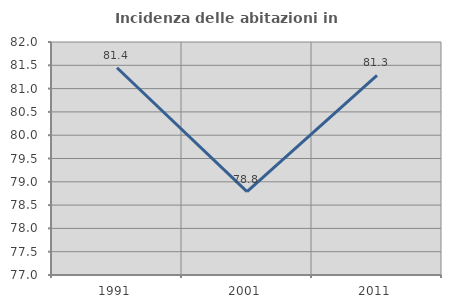
| Category | Incidenza delle abitazioni in proprietà  |
|---|---|
| 1991.0 | 81.447 |
| 2001.0 | 78.788 |
| 2011.0 | 81.282 |